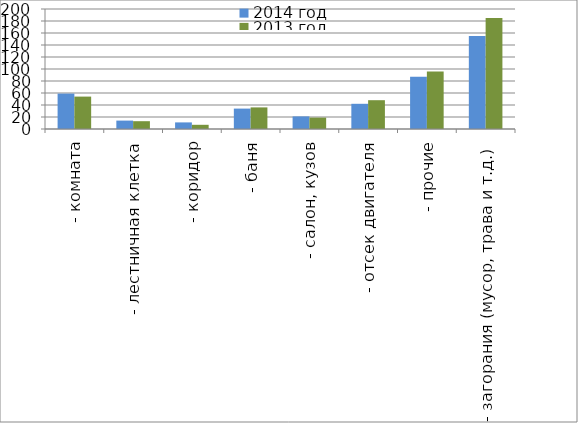
| Category | 2014 год | 2013 год |
|---|---|---|
|  - комната | 59 | 54 |
|  - лестничная клетка | 14 | 13 |
|  - коридор | 11 | 7 |
|  - баня | 34 | 36 |
|  - салон, кузов | 21 | 19 |
|  - отсек двигателя | 42 | 48 |
| - прочие | 87 | 96 |
| - загорания (мусор, трава и т.д.)  | 155 | 185 |